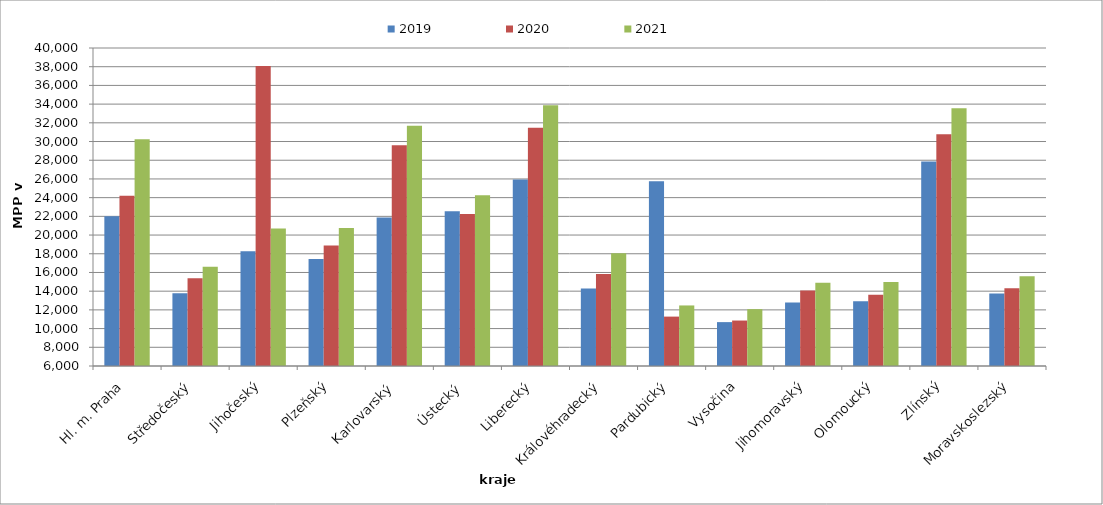
| Category | 2019 | 2020 | 2021 |
|---|---|---|---|
| Hl. m. Praha | 22007.249 | 24205.518 | 30242.815 |
| Středočeský | 13787.52 | 15372.288 | 16622.476 |
| Jihočeský | 18260.336 | 38065.64 | 20697.928 |
| Plzeňský | 17431.579 | 18870.568 | 20757.726 |
| Karlovarský  | 21866.667 | 29600 | 31680 |
| Ústecký   | 22548.82 | 22244.735 | 24246.557 |
| Liberecký | 25947.719 | 31466.21 | 33892.187 |
| Královéhradecký | 14273.684 | 15843.98 | 18062.725 |
| Pardubický | 25740.36 | 11281.241 | 12473.925 |
| Vysočina | 10692.168 | 10860.759 | 12079.804 |
| Jihomoravský | 12789.464 | 14071.496 | 14892.944 |
| Olomoucký | 12931.874 | 13624.03 | 14986.322 |
| Zlínský | 27857.832 | 30785.101 | 33570.006 |
| Moravskoslezský | 13750.588 | 14300.383 | 15583.751 |